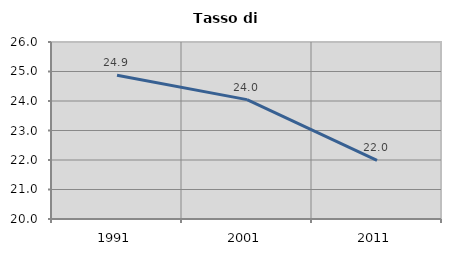
| Category | Tasso di disoccupazione   |
|---|---|
| 1991.0 | 24.876 |
| 2001.0 | 24.047 |
| 2011.0 | 21.984 |